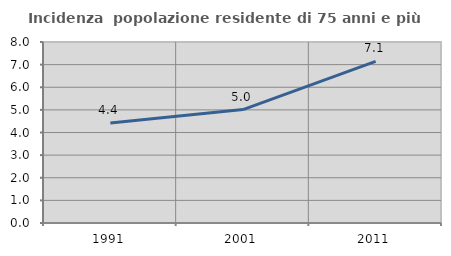
| Category | Incidenza  popolazione residente di 75 anni e più |
|---|---|
| 1991.0 | 4.416 |
| 2001.0 | 5.011 |
| 2011.0 | 7.14 |